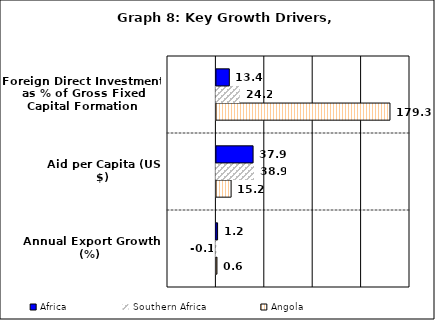
| Category | Angola | Southern Africa | Africa |
|---|---|---|---|
| Annual Export Growth (%) | 0.571 | -0.056 | 1.219 |
| Aid per Capita (US $) | 15.189 | 38.854 | 37.904 |
| Foreign Direct Investment as % of Gross Fixed Capital Formation | 179.313 | 24.179 | 13.354 |